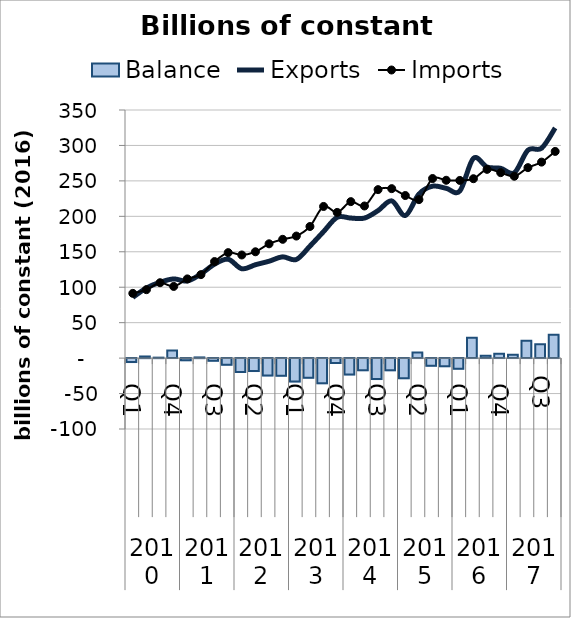
| Category | Balance |
|---|---|
| 0 | -5.642 |
| 1 | 2.314 |
| 2 | 0.659 |
| 3 | 10.576 |
| 4 | -2.978 |
| 5 | 0.982 |
| 6 | -3.667 |
| 7 | -9.333 |
| 8 | -19.461 |
| 9 | -18.291 |
| 10 | -24.582 |
| 11 | -24.742 |
| 12 | -33.082 |
| 13 | -27.664 |
| 14 | -35.493 |
| 15 | -6.887 |
| 16 | -23.181 |
| 17 | -17.048 |
| 18 | -29.601 |
| 19 | -17.249 |
| 20 | -28.257 |
| 21 | 7.878 |
| 22 | -10.79 |
| 23 | -11.341 |
| 24 | -14.908 |
| 25 | 28.753 |
| 26 | 3.228 |
| 27 | 6.149 |
| 28 | 4.872 |
| 29 | 24.627 |
| 30 | 19.618 |
| 31 | 33.116 |